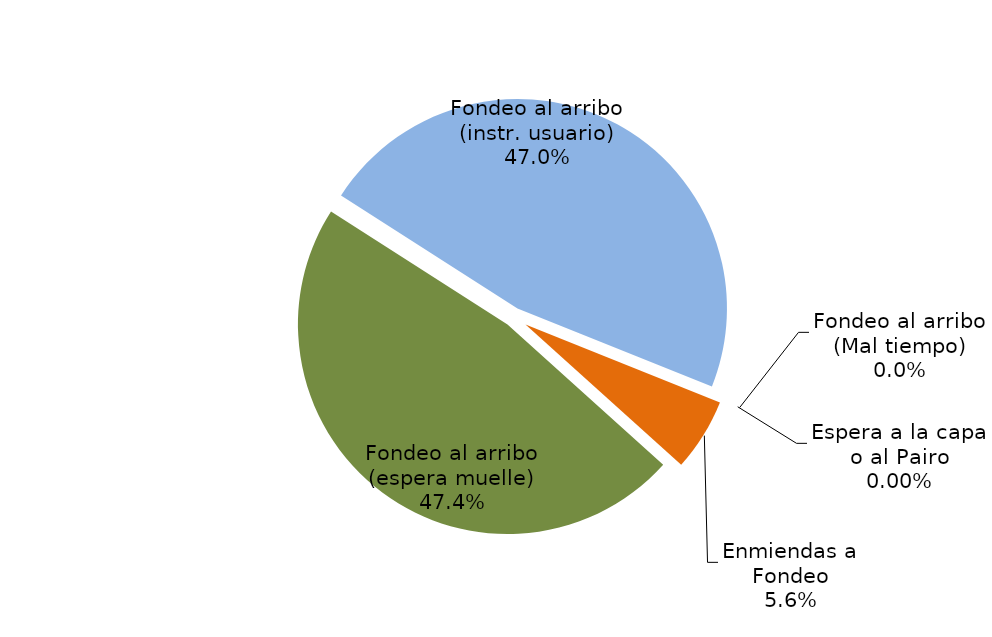
| Category | Series 0 |
|---|---|
| Fondeo al arribo (espera muelle) | 12633.329 |
| Fondeo al arribo (instr. usuario) | 12534.075 |
| Fondeo al arribo (Mal tiempo) | 0 |
| Espera a la capa o al Pairo | 0 |
| Enmiendas a Fondeo | 1490.967 |